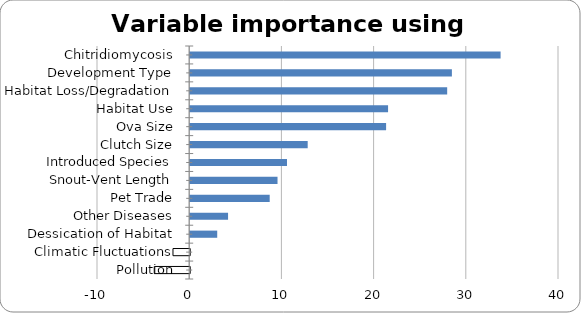
| Category | Series 0 |
|---|---|
| Chitridiomycosis | 33.666 |
| Development Type | 28.383 |
| Habitat Loss/Degradation | 27.872 |
| Habitat Use | 21.461 |
| Ova Size | 21.248 |
| Clutch Size | 12.744 |
| Introduced Species | 10.499 |
| Snout-Vent Length | 9.471 |
| Pet Trade | 8.623 |
| Other Diseases | 4.106 |
| Dessication of Habitat | 2.93 |
| Climatic Fluctuations | -1.814 |
| Pollution | -3.844 |